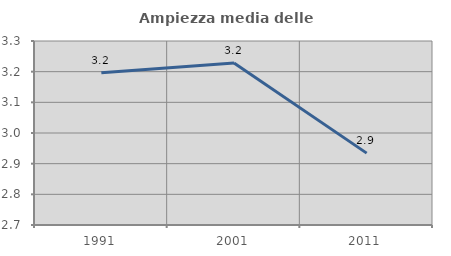
| Category | Ampiezza media delle famiglie |
|---|---|
| 1991.0 | 3.196 |
| 2001.0 | 3.228 |
| 2011.0 | 2.934 |